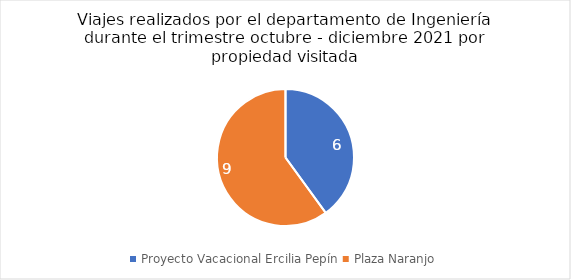
| Category | Series 0 |
|---|---|
| Proyecto Vacacional Ercilia Pepín | 6 |
| Plaza Naranjo | 9 |